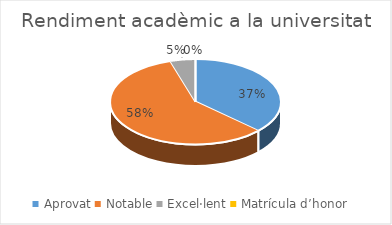
| Category | Series 0 |
|---|---|
| Aprovat | 31 |
| Notable | 49 |
| Excel·lent | 4 |
| Matrícula d’honor | 0 |